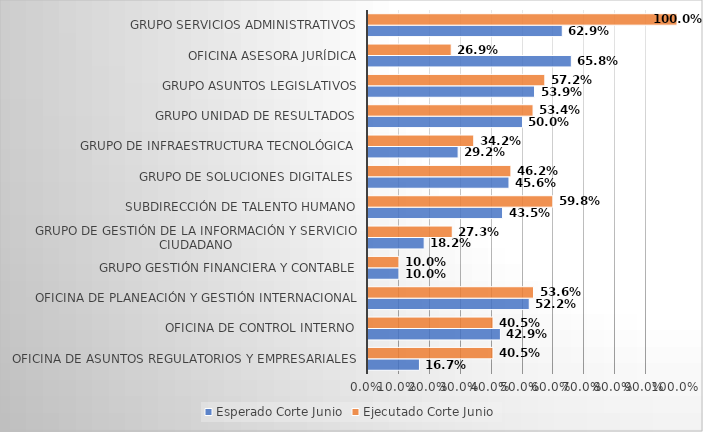
| Category | Esperado Corte Junio | Ejecutado Corte Junio |
|---|---|---|
| Oficina de Asuntos Regulatorios y Empresariales | 0.167 | 0.405 |
| Oficina de Control Interno | 0.429 | 0.405 |
| Oficina de Planeación y Gestión Internacional | 0.522 | 0.536 |
| Grupo Gestión Financiera y Contable | 0.1 | 0.1 |
| Grupo de Gestión de la información y Servicio Ciudadano | 0.182 | 0.273 |
| Subdirección de Talento Humano | 0.435 | 0.598 |
| Grupo de Soluciones Digitales  | 0.456 | 0.462 |
| Grupo de Infraestructura Tecnológica | 0.292 | 0.342 |
| Grupo Unidad de Resultados | 0.5 | 0.534 |
| Grupo Asuntos Legislativos | 0.539 | 0.572 |
| Oficina Asesora Jurídica | 0.658 | 0.269 |
| Grupo Servicios Administrativos | 0.629 | 1 |